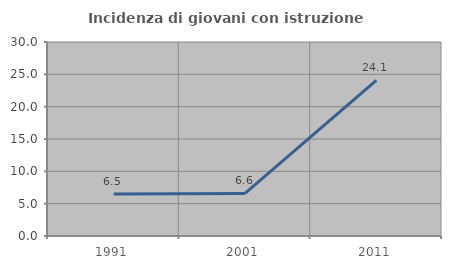
| Category | Incidenza di giovani con istruzione universitaria |
|---|---|
| 1991.0 | 6.494 |
| 2001.0 | 6.579 |
| 2011.0 | 24.074 |